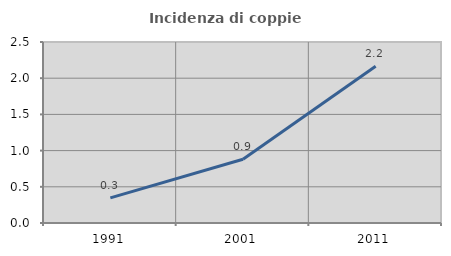
| Category | Incidenza di coppie miste |
|---|---|
| 1991.0 | 0.347 |
| 2001.0 | 0.88 |
| 2011.0 | 2.165 |